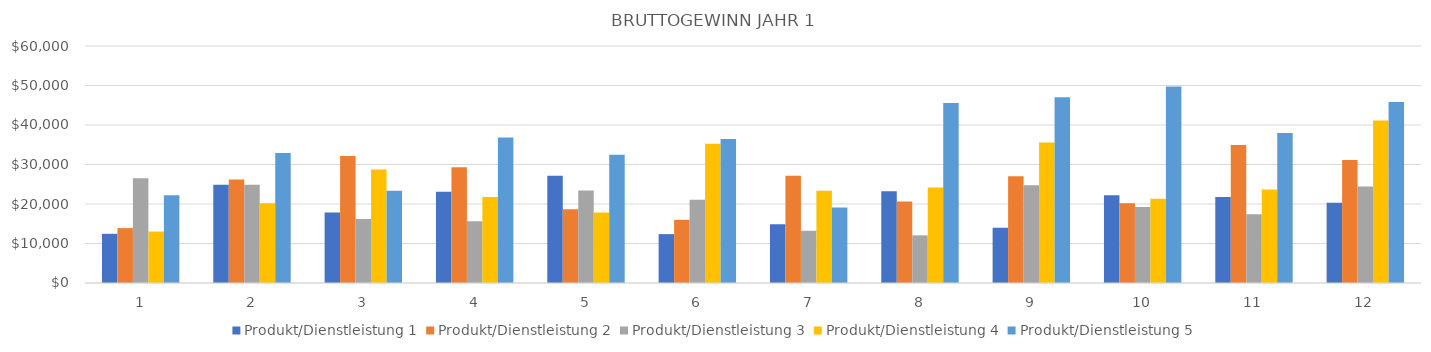
| Category | Produkt/Dienstleistung 1 | Produkt/Dienstleistung 2 | Produkt/Dienstleistung 3 | Produkt/Dienstleistung 4 | Produkt/Dienstleistung 5 |
|---|---|---|---|---|---|
| 0 | 12453 | 13896 | 26541 | 13024 | 22200 |
| 1 | 24899 | 26232 | 24858 | 20218 | 32880 |
| 2 | 17822 | 32152 | 16218 | 28743 | 23385 |
| 3 | 23107.5 | 29287.5 | 15623 | 21766.5 | 36815.5 |
| 4 | 27131 | 18660 | 23400.5 | 17871 | 32465.5 |
| 5 | 12369.5 | 15982.5 | 21063 | 35238 | 36438.5 |
| 6 | 14891.5 | 27142.5 | 13200.5 | 23331 | 19140 |
| 7 | 23211.5 | 20602.5 | 12061.5 | 24202.5 | 45559 |
| 8 | 14007.5 | 27052.5 | 24726.5 | 35595 | 47052.5 |
| 9 | 22218 | 20160 | 19233 | 21329 | 49770 |
| 10 | 21780 | 34920 | 17376 | 23647 | 38000 |
| 11 | 20340 | 31170 | 24420 | 41158 | 45840 |